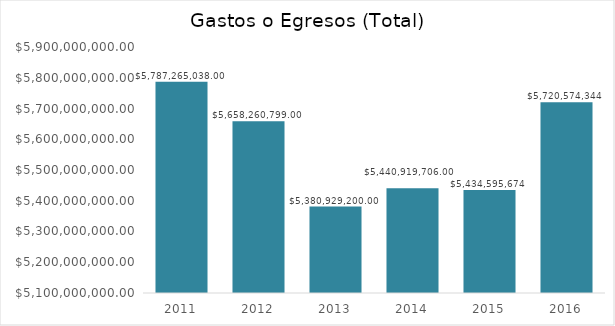
| Category | #REF! |
|---|---|
| 2011.0 | 5787265038 |
| 2012.0 | 5658260799 |
| 2013.0 | 5380929200 |
| 2014.0 | 5440919706 |
| 2015.0 | 5434595674 |
| 2016.0 | 5720574344 |